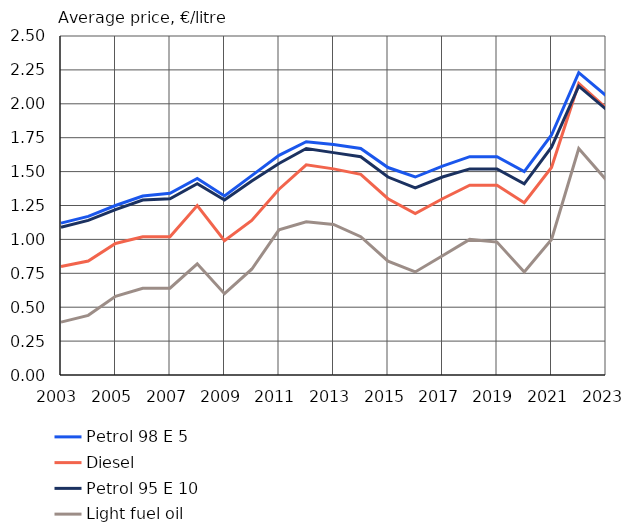
| Category | Petrol 98 E 5 | Diesel | Petrol 95 E 10 | Light fuel oil |
|---|---|---|---|---|
| 2003.0 | 1.12 | 0.8 | 1.09 | 0.39 |
| 2004.0 | 1.17 | 0.84 | 1.14 | 0.44 |
| 2005.0 | 1.25 | 0.97 | 1.22 | 0.58 |
| 2006.0 | 1.32 | 1.02 | 1.29 | 0.64 |
| 2007.0 | 1.34 | 1.02 | 1.3 | 0.64 |
| 2008.0 | 1.45 | 1.25 | 1.41 | 0.82 |
| 2009.0 | 1.32 | 0.99 | 1.29 | 0.6 |
| 2010.0 | 1.47 | 1.14 | 1.43 | 0.78 |
| 2011.0 | 1.62 | 1.37 | 1.56 | 1.07 |
| 2012.0 | 1.72 | 1.55 | 1.67 | 1.13 |
| 2013.0 | 1.7 | 1.52 | 1.64 | 1.11 |
| 2014.0 | 1.67 | 1.48 | 1.61 | 1.02 |
| 2015.0 | 1.53 | 1.3 | 1.46 | 0.84 |
| 2016.0 | 1.46 | 1.19 | 1.38 | 0.76 |
| 2017.0 | 1.54 | 1.3 | 1.46 | 0.88 |
| 2018.0 | 1.61 | 1.4 | 1.52 | 1 |
| 2019.0 | 1.61 | 1.4 | 1.52 | 0.98 |
| 2020.0 | 1.5 | 1.27 | 1.41 | 0.76 |
| 2021.0 | 1.77 | 1.53 | 1.68 | 1 |
| 2022.0 | 2.23 | 2.15 | 2.13 | 1.67 |
| 2023.0 | 2.06 | 1.97 | 1.96 | 1.44 |